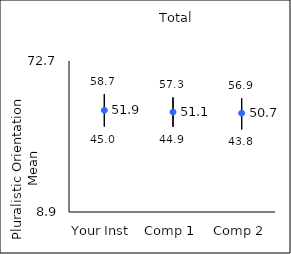
| Category | 25th percentile | 75th percentile | Mean |
|---|---|---|---|
| Your Inst | 45 | 58.7 | 51.87 |
| Comp 1 | 44.9 | 57.3 | 51.13 |
| Comp 2 | 43.8 | 56.9 | 50.67 |